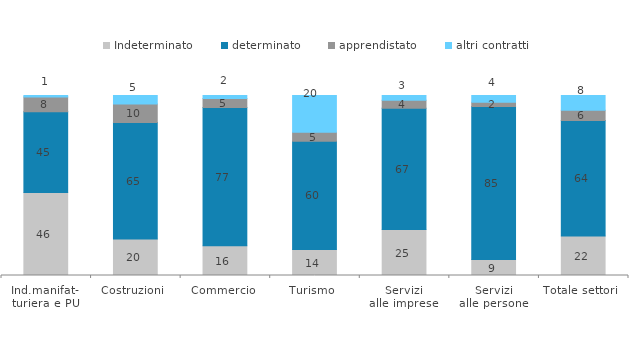
| Category | Indeterminato | determinato | apprendistato | altri contratti |
|---|---|---|---|---|
| Ind.manifat-
turiera e PU | 46.085 | 44.906 | 8.177 | 0.832 |
| Costruzioni | 20.312 | 64.663 | 10.337 | 4.688 |
| Commercio | 16.478 | 76.896 | 4.969 | 1.656 |
| Turismo | 14.396 | 60.175 | 5.044 | 20.385 |
| Servizi
alle imprese | 25.497 | 67.462 | 4.373 | 2.669 |
| Servizi
alle persone | 8.847 | 85.106 | 2.24 | 3.807 |
| Totale settori | 21.968 | 64.203 | 5.621 | 8.207 |